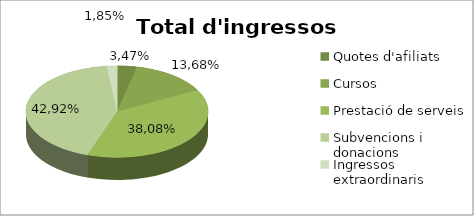
| Category | Series 0 | Series 1 |
|---|---|---|
| Quotes d'afiliats | 5950 | 3.47 |
| Cursos | 23425 | 13.68 |
| Prestació de serveis | 65177.67 | 38.08 |
| Subvencions i donacions | 73412.53 | 42.92 |
| Ingressos extraordinaris | 3170 | 1.85 |